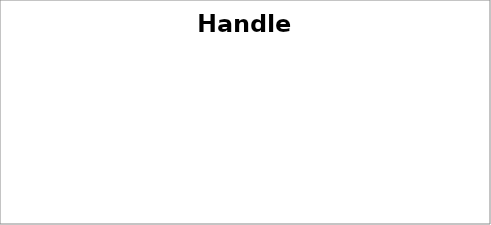
| Category | HANDLES |
|---|---|
| Hit Handle | 239 |
| Handle Color | 217 |
| Hafting Marks Handles | 71 |
| Seams/Holes | 61 |
| Cracked Handle | 32 |
| Bad Handle Rivets | 1 |
| Burned Handles | 1 |
| Open Handles | 1 |